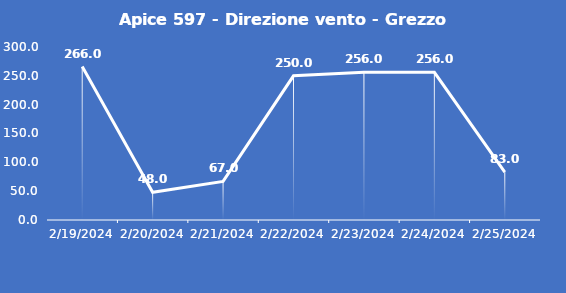
| Category | Apice 597 - Direzione vento - Grezzo (°N) |
|---|---|
| 2/19/24 | 266 |
| 2/20/24 | 48 |
| 2/21/24 | 67 |
| 2/22/24 | 250 |
| 2/23/24 | 256 |
| 2/24/24 | 256 |
| 2/25/24 | 83 |